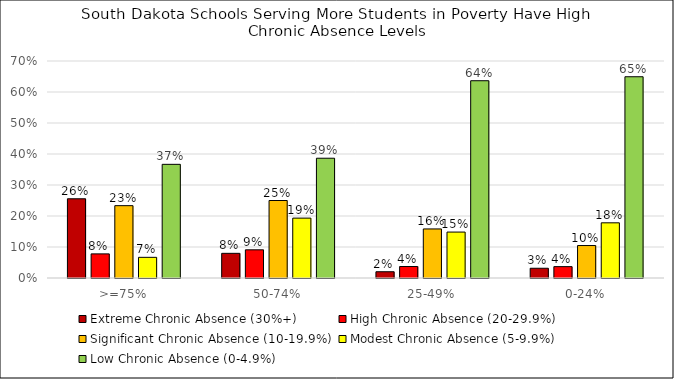
| Category | Extreme Chronic Absence (30%+) | High Chronic Absence (20-29.9%) | Significant Chronic Absence (10-19.9%) | Modest Chronic Absence (5-9.9%) | Low Chronic Absence (0-4.9%) |
|---|---|---|---|---|---|
| >=75% | 0.256 | 0.078 | 0.233 | 0.067 | 0.367 |
| 50-74% | 0.08 | 0.091 | 0.25 | 0.193 | 0.386 |
| 25-49% | 0.02 | 0.037 | 0.158 | 0.148 | 0.636 |
| 0-24% | 0.031 | 0.037 | 0.105 | 0.178 | 0.649 |